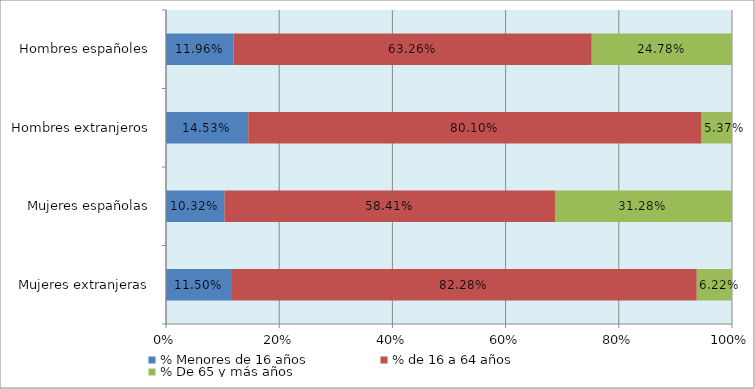
| Category | % Menores de 16 años | % de 16 a 64 años | % De 65 y más años |
|---|---|---|---|
| Mujeres extranjeras | 0.115 | 0.823 | 0.062 |
| Mujeres españolas | 0.103 | 0.584 | 0.313 |
| Hombres extranjeros | 0.145 | 0.801 | 0.054 |
| Hombres españoles | 0.12 | 0.633 | 0.248 |